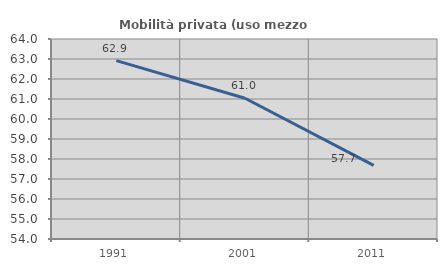
| Category | Mobilità privata (uso mezzo privato) |
|---|---|
| 1991.0 | 62.921 |
| 2001.0 | 61.039 |
| 2011.0 | 57.683 |